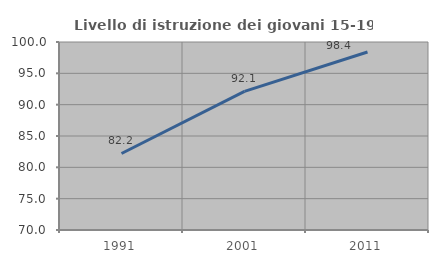
| Category | Livello di istruzione dei giovani 15-19 anni |
|---|---|
| 1991.0 | 82.213 |
| 2001.0 | 92.126 |
| 2011.0 | 98.4 |